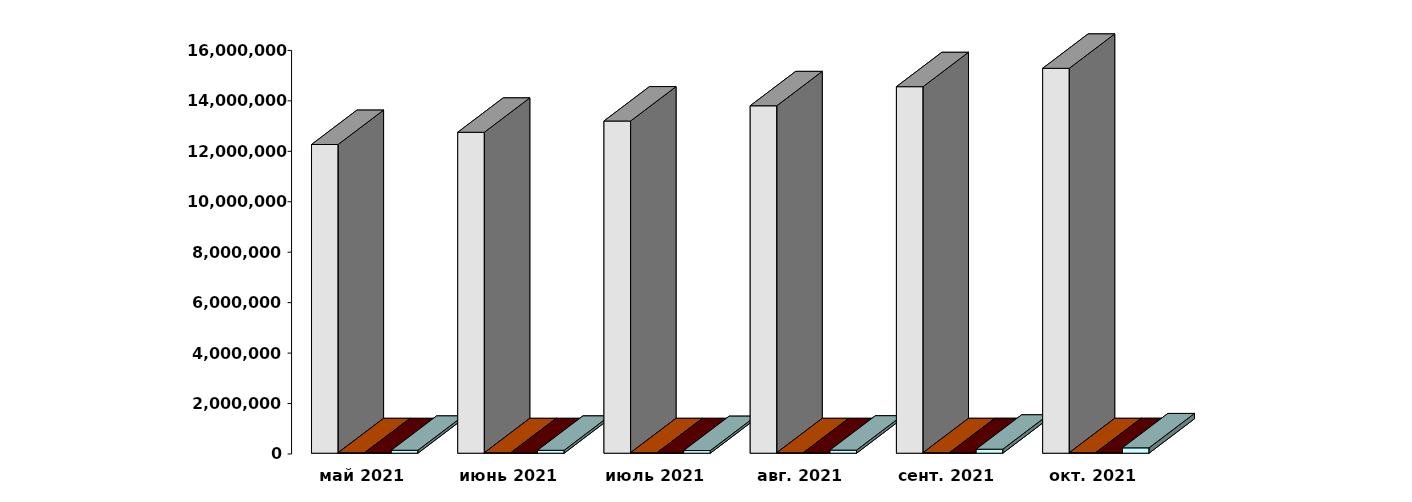
| Category | Физические лица | Юридические лица | Иностранные лица | Клиенты, передавшие свои средства в ДУ |
|---|---|---|---|---|
| 2021-05-30 | 12238639 | 19619 | 18804 | 116061 |
| 2021-06-30 | 12722884 | 19751 | 19280 | 115649 |
| 2021-07-30 | 13169586 | 19875 | 19720 | 105728 |
| 2021-08-30 | 13773190 | 19995 | 20283 | 122307 |
| 2021-09-30 | 14530193 | 20081 | 21060 | 158895 |
| 2021-10-31 | 15258509 | 20154 | 21894 | 212008 |